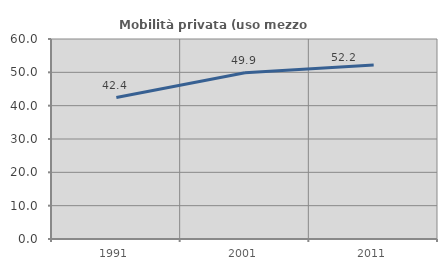
| Category | Mobilità privata (uso mezzo privato) |
|---|---|
| 1991.0 | 42.435 |
| 2001.0 | 49.852 |
| 2011.0 | 52.23 |